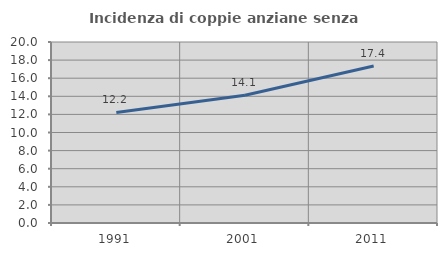
| Category | Incidenza di coppie anziane senza figli  |
|---|---|
| 1991.0 | 12.22 |
| 2001.0 | 14.123 |
| 2011.0 | 17.354 |